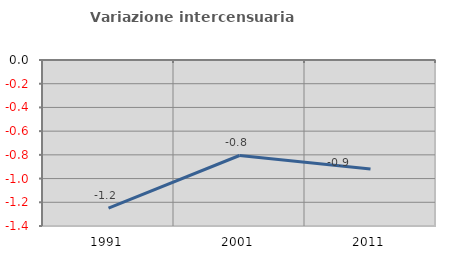
| Category | Variazione intercensuaria annua |
|---|---|
| 1991.0 | -1.249 |
| 2001.0 | -0.805 |
| 2011.0 | -0.92 |